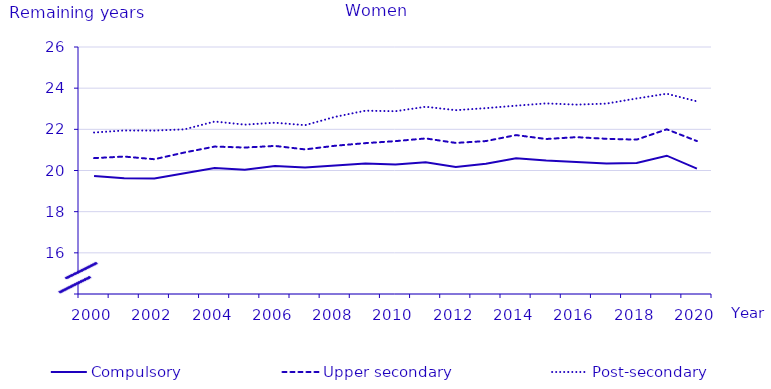
| Category | Compulsory | Upper secondary | Post-secondary |
|---|---|---|---|
| 2000.0 | 19.737 | 20.601 | 21.846 |
| 2001.0 | 19.624 | 20.677 | 21.944 |
| 2002.0 | 19.609 | 20.548 | 21.939 |
| 2003.0 | 19.865 | 20.875 | 21.999 |
| 2004.0 | 20.123 | 21.162 | 22.379 |
| 2005.0 | 20.042 | 21.115 | 22.229 |
| 2006.0 | 20.22 | 21.194 | 22.322 |
| 2007.0 | 20.147 | 21.025 | 22.203 |
| 2008.0 | 20.24 | 21.203 | 22.608 |
| 2009.0 | 20.336 | 21.329 | 22.906 |
| 2010.0 | 20.295 | 21.427 | 22.88 |
| 2011.0 | 20.401 | 21.557 | 23.097 |
| 2012.0 | 20.17 | 21.34 | 22.93 |
| 2013.0 | 20.33 | 21.43 | 23.03 |
| 2014.0 | 20.59 | 21.72 | 23.15 |
| 2015.0 | 20.48 | 21.53 | 23.26 |
| 2016.0 | 20.41 | 21.62 | 23.2 |
| 2017.0 | 20.34 | 21.54 | 23.25 |
| 2018.0 | 20.37 | 21.5 | 23.5 |
| 2019.0 | 20.72 | 22 | 23.73 |
| 2020.0 | 20.09 | 21.43 | 23.36 |